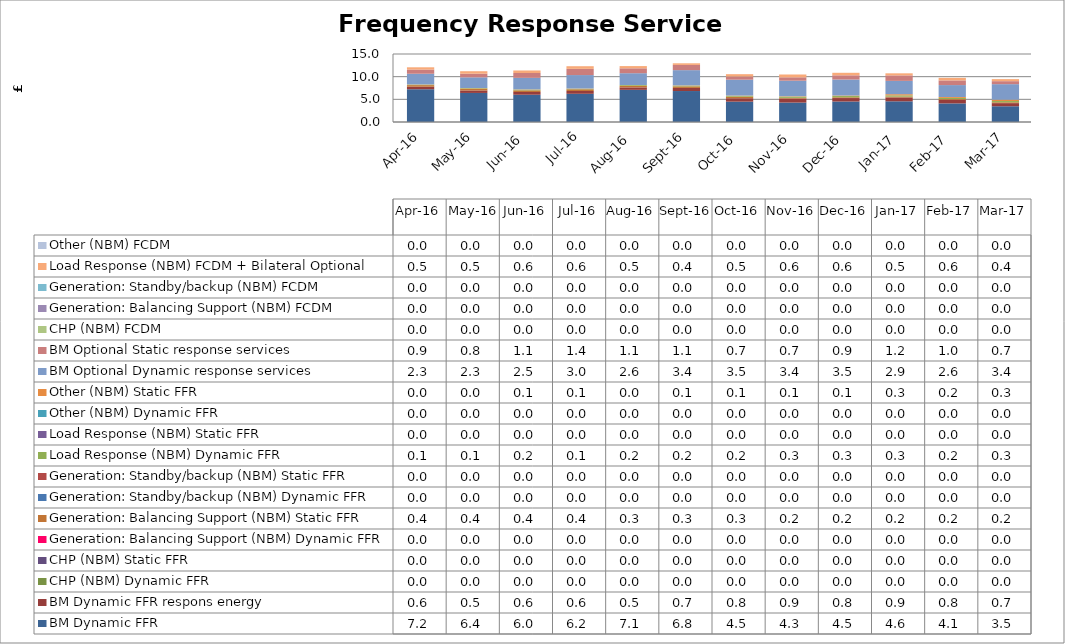
| Category | BM Dynamic FFR | BM Dynamic FFR respons energy | CHP (NBM) Dynamic FFR | CHP (NBM) Static FFR | Generation: Balancing Support (NBM) Dynamic FFR | Generation: Balancing Support (NBM) Static FFR | Generation: Standby/backup (NBM) Dynamic FFR | Generation: Standby/backup (NBM) Static FFR | Load Response (NBM) Dynamic FFR | Load Response (NBM) Static FFR | Other (NBM) Dynamic FFR | Other (NBM) Static FFR | BM Optional Dynamic response services | BM Optional Static response services | CHP (NBM) FCDM | Generation: Balancing Support (NBM) FCDM | Generation: Standby/backup (NBM) FCDM | Load Response (NBM) FCDM + Bilateral Optional | Other (NBM) FCDM |
|---|---|---|---|---|---|---|---|---|---|---|---|---|---|---|---|---|---|---|---|
| 2016-04-01 | 7.227 | 0.554 | 0 | 0 | 0 | 0.356 | 0 | 0 | 0.115 | 0 | 0 | 0.042 | 2.349 | 0.923 | 0 | 0 | 0 | 0.501 | 0 |
| 2016-05-01 | 6.411 | 0.547 | 0 | 0 | 0 | 0.387 | 0 | 0 | 0.123 | 0 | 0 | 0.035 | 2.343 | 0.812 | 0 | 0 | 0 | 0.545 | 0 |
| 2016-06-01 | 6.015 | 0.604 | 0 | 0 | 0 | 0.366 | 0 | 0 | 0.166 | 0 | 0 | 0.051 | 2.538 | 1.073 | 0 | 0 | 0 | 0.551 | 0 |
| 2016-07-01 | 6.218 | 0.622 | 0 | 0 | 0 | 0.378 | 0 | 0 | 0.123 | 0 | 0 | 0.054 | 2.959 | 1.371 | 0 | 0 | 0 | 0.581 | 0 |
| 2016-08-01 | 7.095 | 0.54 | 0 | 0 | 0 | 0.344 | 0 | 0 | 0.166 | 0 | 0 | 0.018 | 2.599 | 1.079 | 0 | 0 | 0 | 0.494 | 0 |
| 2016-09-01 | 6.832 | 0.68 | 0 | 0 | 0 | 0.35 | 0 | 0 | 0.166 | 0 | 0 | 0.059 | 3.353 | 1.146 | 0 | 0 | 0 | 0.364 | 0 |
| 2016-10-01 | 4.487 | 0.755 | 0 | 0 | 0 | 0.345 | 0 | 0 | 0.172 | 0 | 0 | 0.076 | 3.5 | 0.692 | 0 | 0 | 0 | 0.525 | 0 |
| 2016-11-01 | 4.281 | 0.883 | 0 | 0 | 0 | 0.166 | 0 | 0 | 0.256 | 0 | 0 | 0.092 | 3.433 | 0.742 | 0 | 0 | 0 | 0.626 | 0 |
| 2016-12-01 | 4.515 | 0.769 | 0 | 0 | 0 | 0.169 | 0 | 0 | 0.274 | 0 | 0 | 0.115 | 3.523 | 0.93 | 0 | 0 | 0 | 0.561 | 0 |
| 2017-01-01 | 4.564 | 0.856 | 0 | 0 | 0 | 0.179 | 0 | 0 | 0.274 | 0 | 0 | 0.26 | 2.937 | 1.212 | 0 | 0 | 0 | 0.455 | 0 |
| 2017-02-01 | 4.1 | 0.8 | 0 | 0 | 0 | 0.171 | 0 | 0 | 0.247 | 0 | 0 | 0.201 | 2.626 | 1.03 | 0 | 0 | 0 | 0.566 | 0 |
| 2017-03-01 | 3.471 | 0.694 | 0 | 0 | 0 | 0.187 | 0 | 0 | 0.273 | 0 | 0 | 0.301 | 3.42 | 0.662 | 0 | 0 | 0 | 0.45 | 0 |